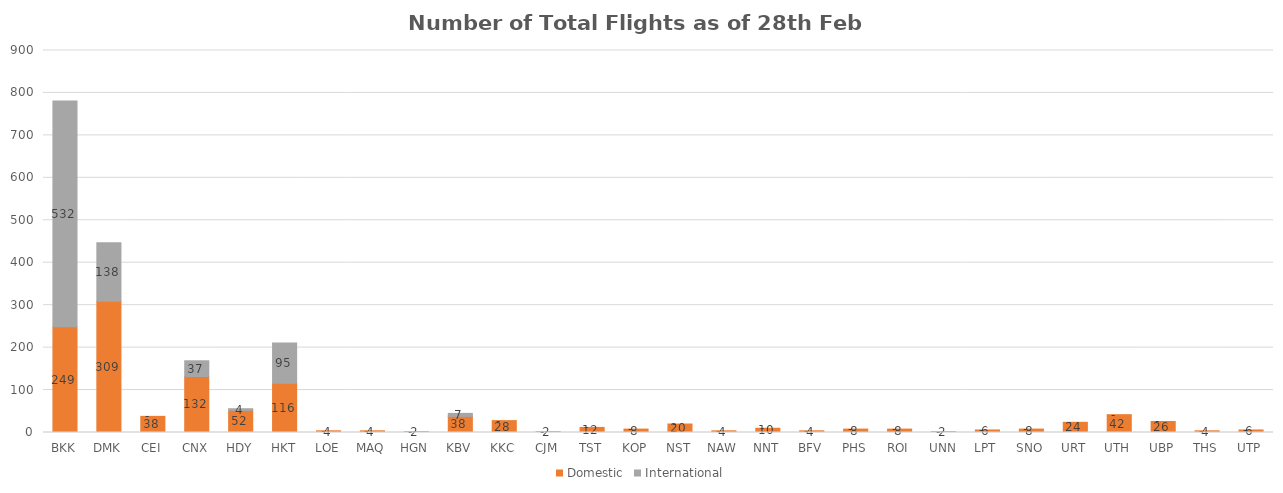
| Category | Domestic | International |
|---|---|---|
| BKK | 249 | 532 |
| DMK | 309 | 138 |
| CEI | 38 | 0 |
| CNX | 132 | 37 |
| HDY | 52 | 4 |
| HKT | 116 | 95 |
| LOE | 4 | 0 |
| MAQ | 4 | 0 |
| HGN | 2 | 0 |
| KBV | 38 | 7 |
| KKC | 28 | 0 |
| CJM | 2 | 0 |
| TST | 12 | 0 |
| KOP | 8 | 0 |
| NST | 20 | 0 |
| NAW | 4 | 0 |
| NNT | 10 | 0 |
| BFV | 4 | 0 |
| PHS | 8 | 0 |
| ROI | 8 | 0 |
| UNN | 2 | 0 |
| LPT | 6 | 0 |
| SNO | 8 | 0 |
| URT | 24 | 0 |
| UTH | 42 | 0 |
| UBP | 26 | 0 |
| THS | 4 | 0 |
| UTP | 6 | 0 |